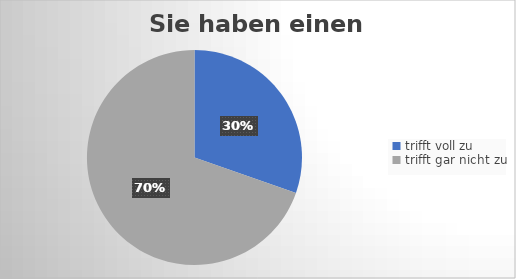
| Category | Sie haben einen Migrationshintergrund. |
|---|---|
| trifft voll zu | 85 |
| trifft gar nicht zu | 195 |